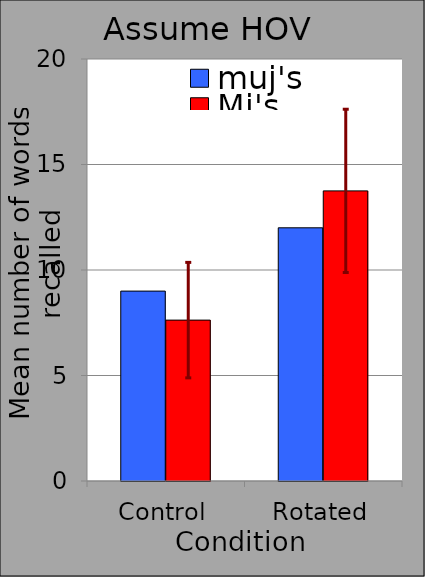
| Category | muj's | Mj's |
|---|---|---|
| Control | 9 | 7.625 |
| Rotated | 12 | 13.75 |